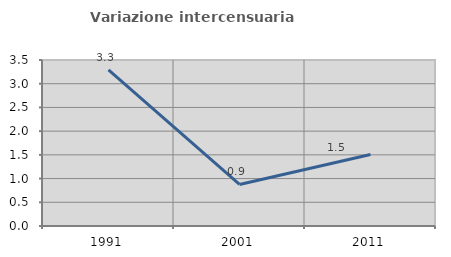
| Category | Variazione intercensuaria annua |
|---|---|
| 1991.0 | 3.292 |
| 2001.0 | 0.877 |
| 2011.0 | 1.508 |